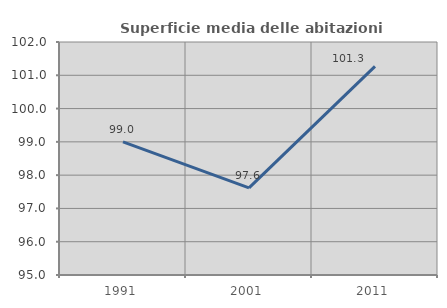
| Category | Superficie media delle abitazioni occupate |
|---|---|
| 1991.0 | 99.002 |
| 2001.0 | 97.617 |
| 2011.0 | 101.268 |